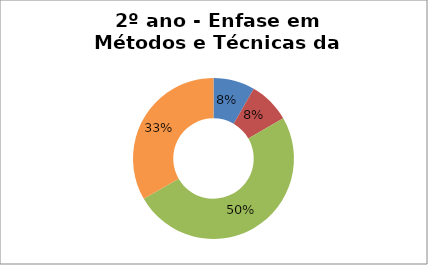
| Category | Series 0 |
|---|---|
| Prog | 1 |
| Tec | 1 |
| MeT | 6 |
| Prof | 4 |